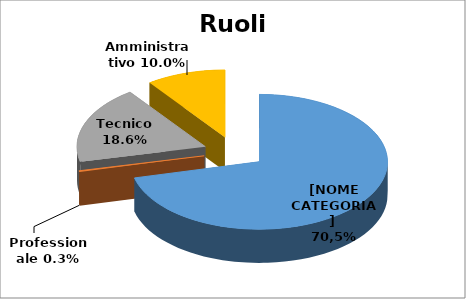
| Category | Series 0 |
|---|---|
| Sanitario | 0.711 |
| Professionale | 0.003 |
| Tecnico | 0.186 |
| Amministrativo | 0.1 |